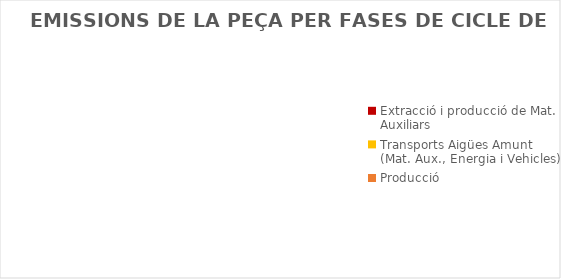
| Category | Series 0 |
|---|---|
| Extracció i producció de Mat. Auxiliars | 0 |
| Transports Aigües Amunt (Mat. Aux., Energia i Vehicles) | 0 |
| Producció | 0 |